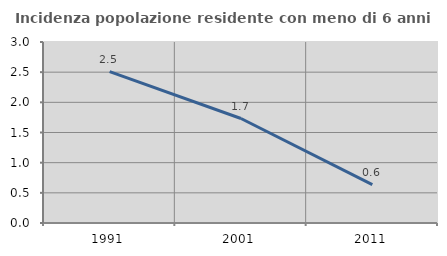
| Category | Incidenza popolazione residente con meno di 6 anni |
|---|---|
| 1991.0 | 2.508 |
| 2001.0 | 1.732 |
| 2011.0 | 0.637 |